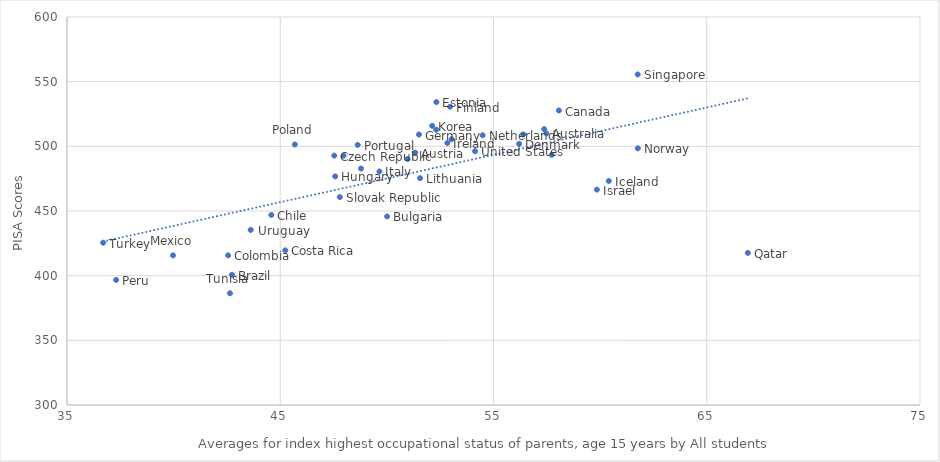
| Category | Series 0 |
|---|---|
| 57.4796339755256 | 509.994 |
| 51.3311783942773 | 495.037 |
| 42.7359552245755 | 400.682 |
| 50.0124059299921 | 445.772 |
| 58.0644896521407 | 527.705 |
| 44.5826443366238 | 446.956 |
| 42.556107136157 | 415.729 |
| 45.2371065168532 | 419.608 |
| 47.5336516840344 | 492.83 |
| 56.2029137150772 | 501.937 |
| 52.3215719773497 | 534.194 |
| 52.9625946268856 | 530.661 |
| 51.3087493584009 | 494.978 |
| 51.5031703071997 | 509.141 |
| 47.5770213929197 | 476.748 |
| 60.408808299301 | 473.23 |
| 52.8347521012238 | 502.575 |
| 59.8477637926296 | 466.553 |
| 49.6516656279496 | 480.547 |
| 52.127836626395 | 515.81 |
| 50.9756657064411 | 490.225 |
| 51.5565825010243 | 475.409 |
| 48.788617418681 | 482.806 |
| 39.9727520226008 | 415.71 |
| 54.4910826664352 | 508.575 |
| 57.3772473465424 | 513.304 |
| 61.7679745099367 | 498.481 |
| 37.3039058021645 | 396.684 |
| 45.6839149463998 | 501.435 |
| 48.6312100174645 | 501.1 |
| 66.9277951533173 | 417.611 |
| 61.7625708727809 | 555.575 |
| 47.794081344254 | 460.775 |
| 52.3148978284449 | 512.864 |
| 47.9680501734835 | 492.786 |
| 57.7301171126626 | 493.422 |
| 53.0378993950188 | 505.506 |
| 42.6434469462676 | 386.403 |
| 36.6956985463522 | 425.49 |
| 56.3972897575877 | 509.222 |
| 54.1348390693039 | 496.242 |
| 43.6143736538623 | 435.363 |